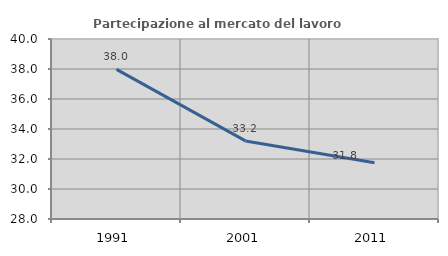
| Category | Partecipazione al mercato del lavoro  femminile |
|---|---|
| 1991.0 | 37.979 |
| 2001.0 | 33.205 |
| 2011.0 | 31.753 |